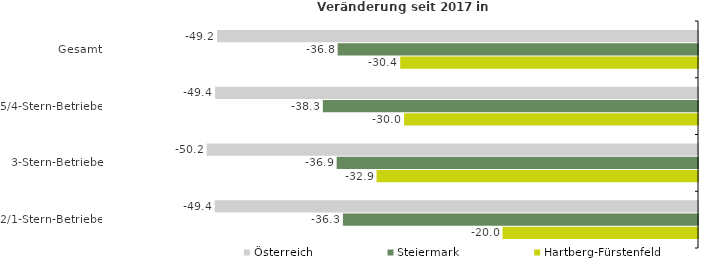
| Category | Österreich | Steiermark | Hartberg-Fürstenfeld |
|---|---|---|---|
| Gesamt | -49.154 | -36.835 | -30.44 |
| 5/4-Stern-Betriebe | -49.355 | -38.346 | -30.042 |
| 3-Stern-Betriebe | -50.222 | -36.936 | -32.853 |
| 2/1-Stern-Betriebe | -49.399 | -36.296 | -19.981 |